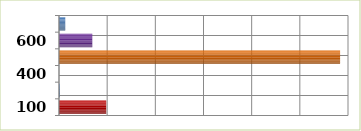
| Category | Series 0 |
|---|---|
| 100.0 | 4899600 |
| 200.0 | 83000 |
| 400.0 | 0 |
| 500.0 | 29179385.3 |
| 600.0 | 3455249 |
| 700.0 | 650166 |